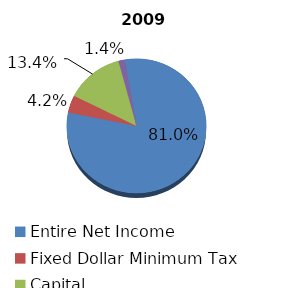
| Category | 2009 |
|---|---|
| Entire Net Income | 1445009943 |
| Fixed Dollar Minimum Tax | 74415891 |
| Capital | 239698164 |
| Alternative Minimum Taxable Income | 25092346 |